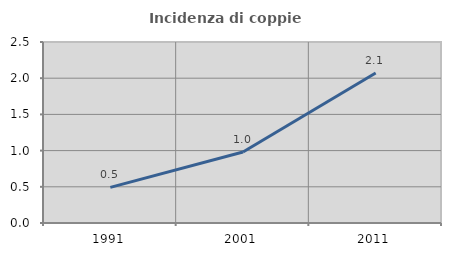
| Category | Incidenza di coppie miste |
|---|---|
| 1991.0 | 0.491 |
| 2001.0 | 0.98 |
| 2011.0 | 2.072 |